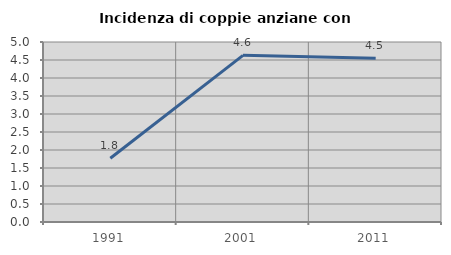
| Category | Incidenza di coppie anziane con figli |
|---|---|
| 1991.0 | 1.77 |
| 2001.0 | 4.63 |
| 2011.0 | 4.545 |